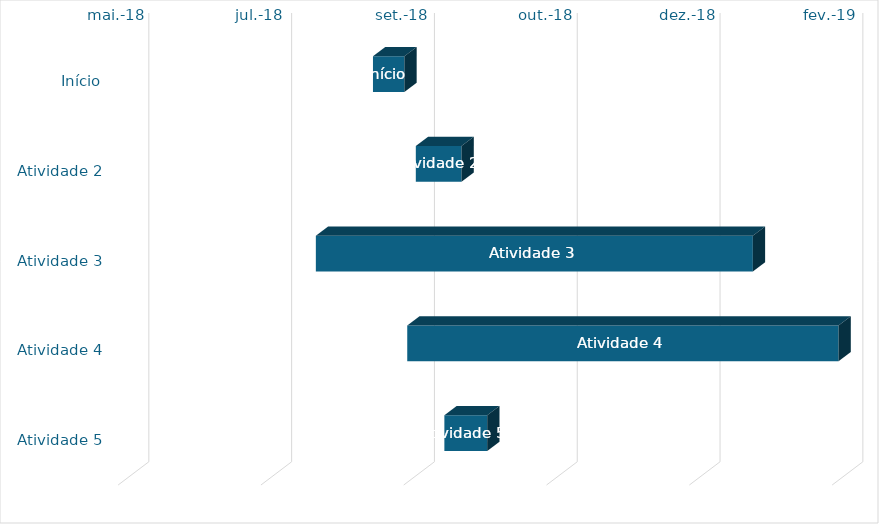
| Category | data | duração |
|---|---|---|
| Início | 24/08/2018 | 11 |
| Atividade 2 | 08/09/2018 | 16 |
| Atividade 3 | 04/08/2018 | 153 |
| Atividade 4 | 05/09/2018 | 151 |
| Atividade 5 | 18/09/2018 | 15 |